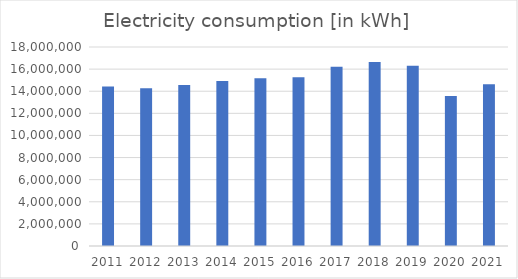
| Category | [kWh] |
|---|---|
| 2011.0 | 14433495 |
| 2012.0 | 14275264 |
| 2013.0 | 14565319 |
| 2014.0 | 14915895 |
| 2015.0 | 15164597 |
| 2016.0 | 15261931 |
| 2017.0 | 16207041 |
| 2018.0 | 16647600.3 |
| 2019.0 | 16296795 |
| 2020.0 | 13578150 |
| 2021.0 | 14638998 |